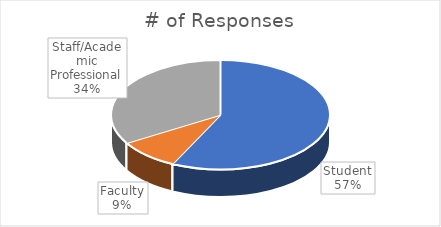
| Category | # of Participants |
|---|---|
| Student | 0.572 |
| Faculty | 0.092 |
| Staff/Academic Professional | 0.336 |